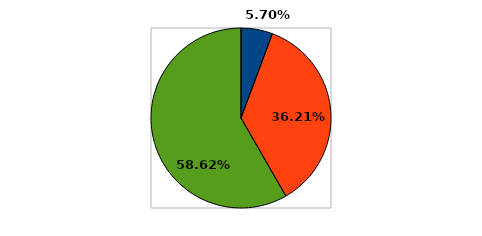
| Category | Series 0 |
|---|---|
| 0 | 0.057 |
| 1 | 0.362 |
| 2 | 0.586 |